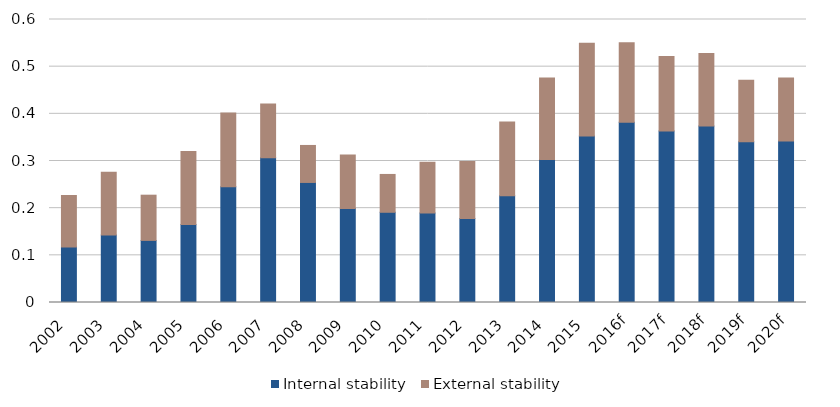
| Category | Internal stability | External stability |
|---|---|---|
| 2002 | 0.118 | 0.109 |
| 2003 | 0.143 | 0.133 |
| 2004 | 0.132 | 0.096 |
| 2005 | 0.165 | 0.155 |
| 2006 | 0.245 | 0.157 |
| 2007 | 0.307 | 0.114 |
| 2008 | 0.255 | 0.078 |
| 2009 | 0.199 | 0.113 |
| 2010 | 0.191 | 0.08 |
| 2011 | 0.19 | 0.107 |
| 2012 | 0.178 | 0.121 |
| 2013 | 0.227 | 0.156 |
| 2014 | 0.303 | 0.173 |
| 2015 | 0.353 | 0.196 |
| 2016f | 0.382 | 0.169 |
| 2017f | 0.363 | 0.158 |
| 2018f | 0.374 | 0.154 |
| 2019f | 0.341 | 0.13 |
| 2020f | 0.342 | 0.134 |